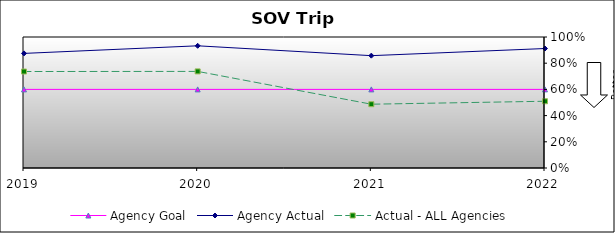
| Category | Agency Goal | Agency Actual | Actual - ALL Agencies |
|---|---|---|---|
| 2019.0 | 0.6 | 0.875 | 0.736 |
| 2020.0 | 0.6 | 0.933 | 0.737 |
| 2021.0 | 0.6 | 0.858 | 0.487 |
| 2022.0 | 0.6 | 0.912 | 0.509 |